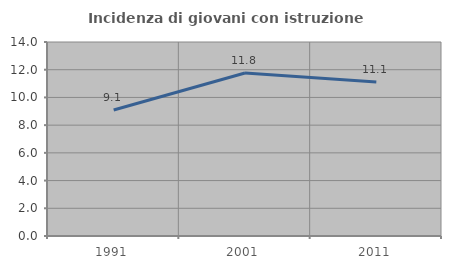
| Category | Incidenza di giovani con istruzione universitaria |
|---|---|
| 1991.0 | 9.091 |
| 2001.0 | 11.765 |
| 2011.0 | 11.111 |